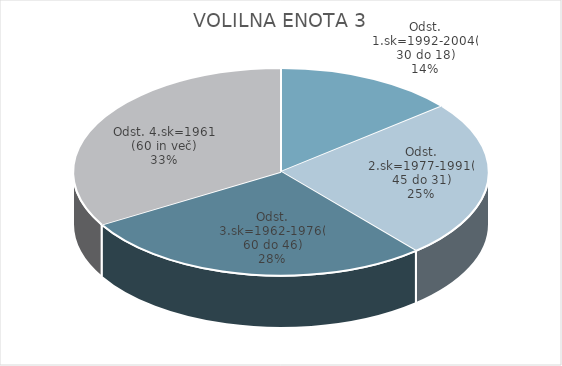
| Category | VOLILNA ENOTA 3 |
|---|---|
| Odst. 1.sk=1992-2004(30 do 18) | 10.33 |
| Odst. 2.sk=1977-1991(45 do 31) | 18.06 |
| Odst. 3.sk=1962-1976(60 do 46) | 20.32 |
| Odst. 4.sk=1961 (60 in več) | 24.52 |